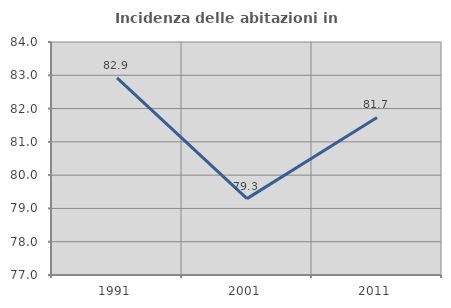
| Category | Incidenza delle abitazioni in proprietà  |
|---|---|
| 1991.0 | 82.921 |
| 2001.0 | 79.295 |
| 2011.0 | 81.733 |